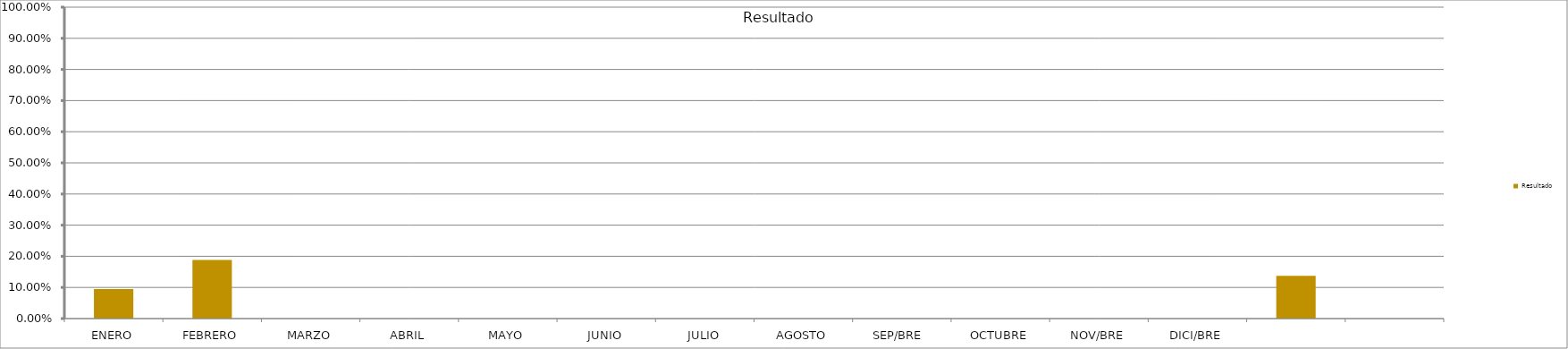
| Category | Resultado  |
|---|---|
| ENERO | 0.095 |
| FEBRERO | 0.188 |
| MARZO | 0 |
| ABRIL | 0 |
| MAYO | 0 |
| JUNIO | 0 |
| JULIO | 0 |
| AGOSTO | 0 |
| SEP/BRE  | 0 |
| OCTUBRE | 0 |
| NOV/BRE | 0 |
| DICI/BRE | 0 |